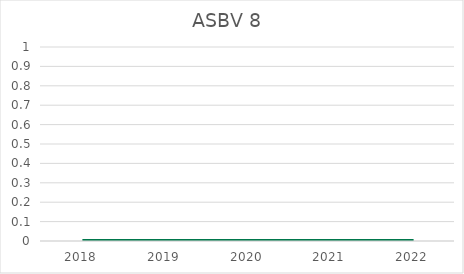
| Category | ASBV 8  |
|---|---|
| 2018.0 | 0 |
| 2019.0 | 0 |
| 2020.0 | 0 |
| 2021.0 | 0 |
| 2022.0 | 0 |